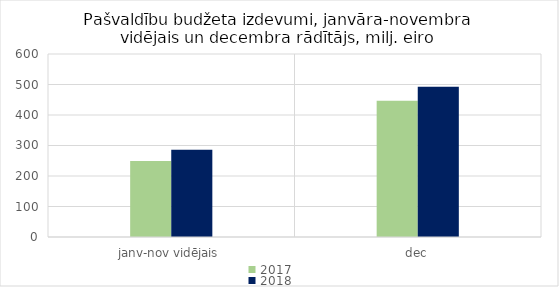
| Category | 2017 | 2018 |
|---|---|---|
| janv-nov vidējais | 249339.219 | 285834.686 |
| dec | 446706.592 | 492764.721 |